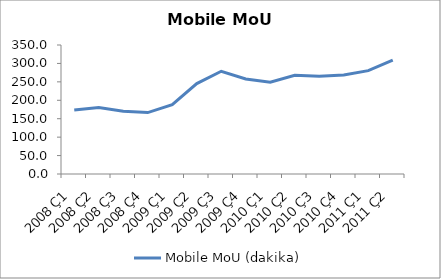
| Category | Mobile MoU (dakika) |
|---|---|
| 2008 Ç1 | 173.9 |
| 2008 Ç2 | 180.6 |
| 2008 Ç3 | 170.4 |
| 2008 Ç4 | 166.7 |
| 2009 Ç1 | 188.1 |
| 2009 Ç2 | 245.2 |
| 2009 Ç3 | 278.8 |
| 2009 Ç4 | 258 |
| 2010 Ç1 | 249.1 |
| 2010 Ç2 | 268.1 |
| 2010 Ç3 | 264.9 |
| 2010 Ç4 | 268.5 |
| 2011 Ç1 | 280.5 |
| 2011 Ç2 | 309.1 |